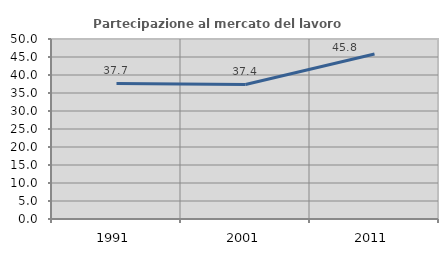
| Category | Partecipazione al mercato del lavoro  femminile |
|---|---|
| 1991.0 | 37.666 |
| 2001.0 | 37.368 |
| 2011.0 | 45.823 |